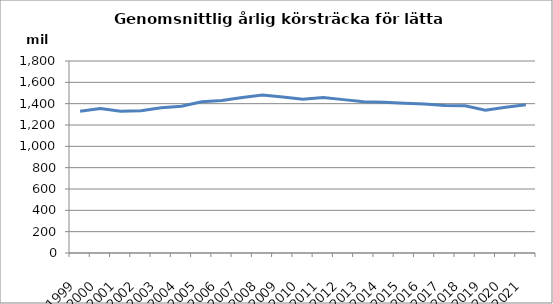
| Category | Series 0 |
|---|---|
| 1999.0 | 1329.255 |
| 2000.0 | 1353.485 |
| 2001.0 | 1328.518 |
| 2002.0 | 1334.573 |
| 2003.0 | 1361.115 |
| 2004.0 | 1376.162 |
| 2005.0 | 1418.08 |
| 2006.0 | 1428.927 |
| 2007.0 | 1457.956 |
| 2008.0 | 1481.99 |
| 2009.0 | 1462.097 |
| 2010.0 | 1441.784 |
| 2011.0 | 1456.994 |
| 2012.0 | 1437.942 |
| 2013.0 | 1418.184 |
| 2014.0 | 1412.603 |
| 2015.0 | 1404.319 |
| 2016.0 | 1397.68 |
| 2017.0 | 1382.375 |
| 2018.0 | 1381.011 |
| 2019.0 | 1338.71 |
| 2020.0 | 1366.383 |
| 2021.0 | 1389.265 |